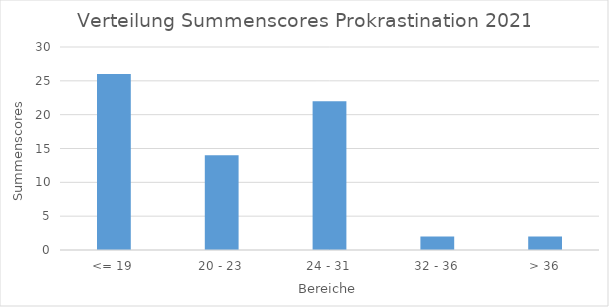
| Category | Anzahl |
|---|---|
| <= 19 | 26 |
| 20 - 23 | 14 |
| 24 - 31 | 22 |
| 32 - 36 | 2 |
| > 36 | 2 |